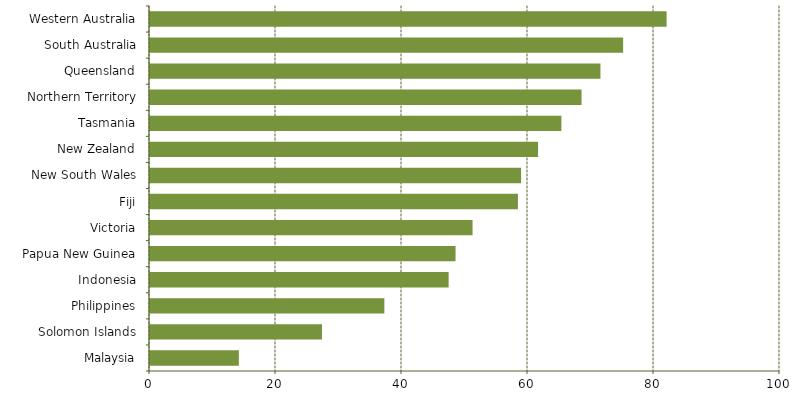
| Category | Series 0 |
|---|---|
| Malaysia | 14.1 |
| Solomon Islands | 27.3 |
| Philippines | 37.2 |
| Indonesia | 47.4 |
| Papua New Guinea | 48.5 |
| Victoria | 51.2 |
| Fiji | 58.4 |
| New South Wales | 58.9 |
| New Zealand | 61.6 |
| Tasmania | 65.3 |
| Northern Territory | 68.5 |
| Queensland | 71.5 |
| South Australia | 75.1 |
| Western Australia | 82 |